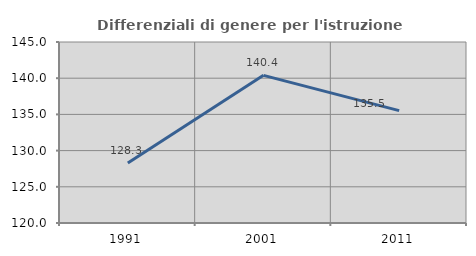
| Category | Differenziali di genere per l'istruzione superiore |
|---|---|
| 1991.0 | 128.297 |
| 2001.0 | 140.395 |
| 2011.0 | 135.52 |